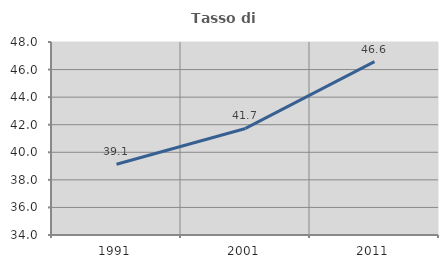
| Category | Tasso di occupazione   |
|---|---|
| 1991.0 | 39.13 |
| 2001.0 | 41.73 |
| 2011.0 | 46.582 |